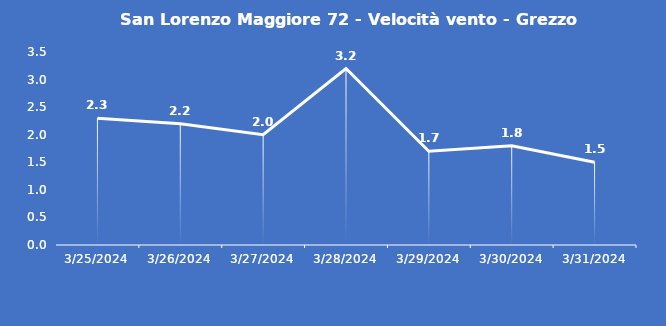
| Category | San Lorenzo Maggiore 72 - Velocità vento - Grezzo (m/s) |
|---|---|
| 3/25/24 | 2.3 |
| 3/26/24 | 2.2 |
| 3/27/24 | 2 |
| 3/28/24 | 3.2 |
| 3/29/24 | 1.7 |
| 3/30/24 | 1.8 |
| 3/31/24 | 1.5 |